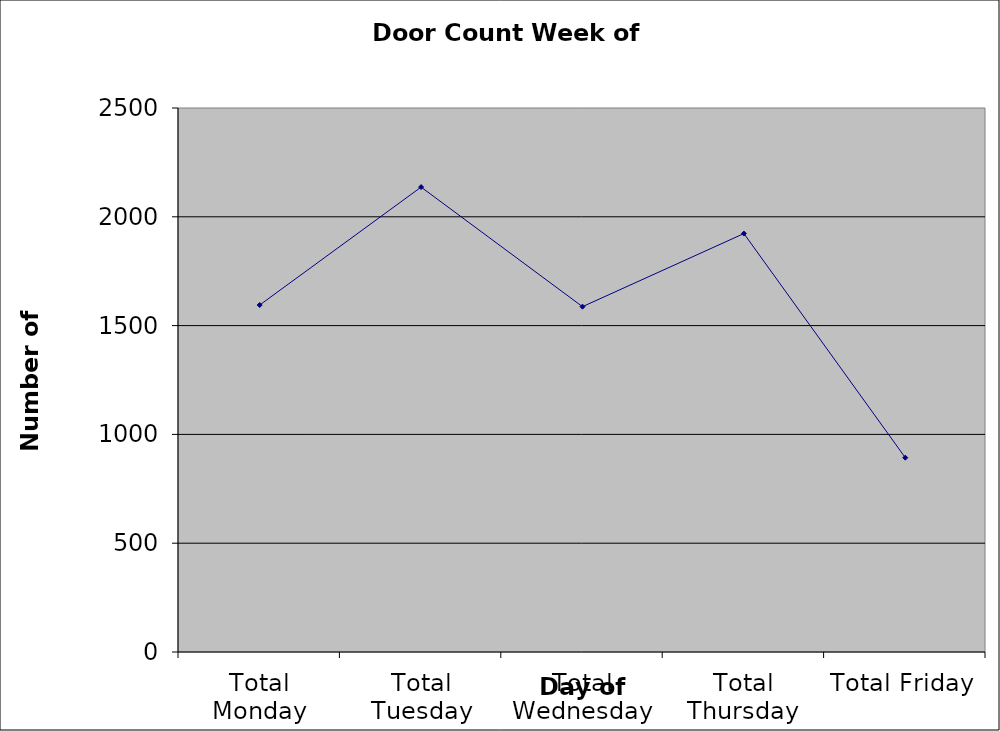
| Category | Series 0 |
|---|---|
| Total Monday | 1594.5 |
| Total Tuesday | 2136.5 |
| Total Wednesday | 1587 |
| Total Thursday | 1923 |
| Total Friday | 893 |